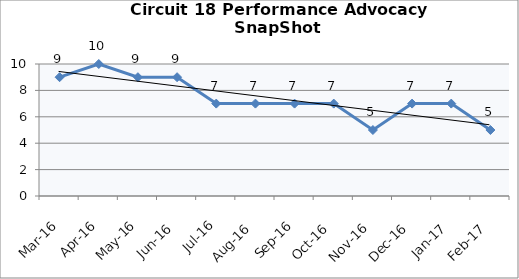
| Category | Circuit 18 |
|---|---|
| Mar-16 | 9 |
| Apr-16 | 10 |
| May-16 | 9 |
| Jun-16 | 9 |
| Jul-16 | 7 |
| Aug-16 | 7 |
| Sep-16 | 7 |
| Oct-16 | 7 |
| Nov-16 | 5 |
| Dec-16 | 7 |
| Jan-17 | 7 |
| Feb-17 | 5 |